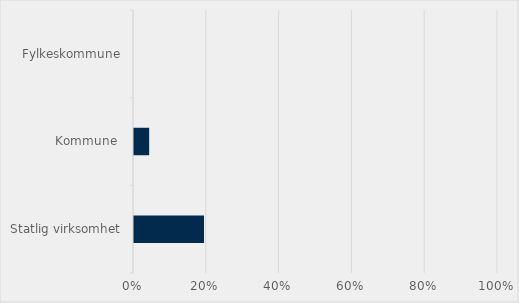
| Category | Series 0 |
|---|---|
| Statlig virksomhet | 0.192 |
| Kommune  | 0.042 |
| Fylkeskommune | 0 |